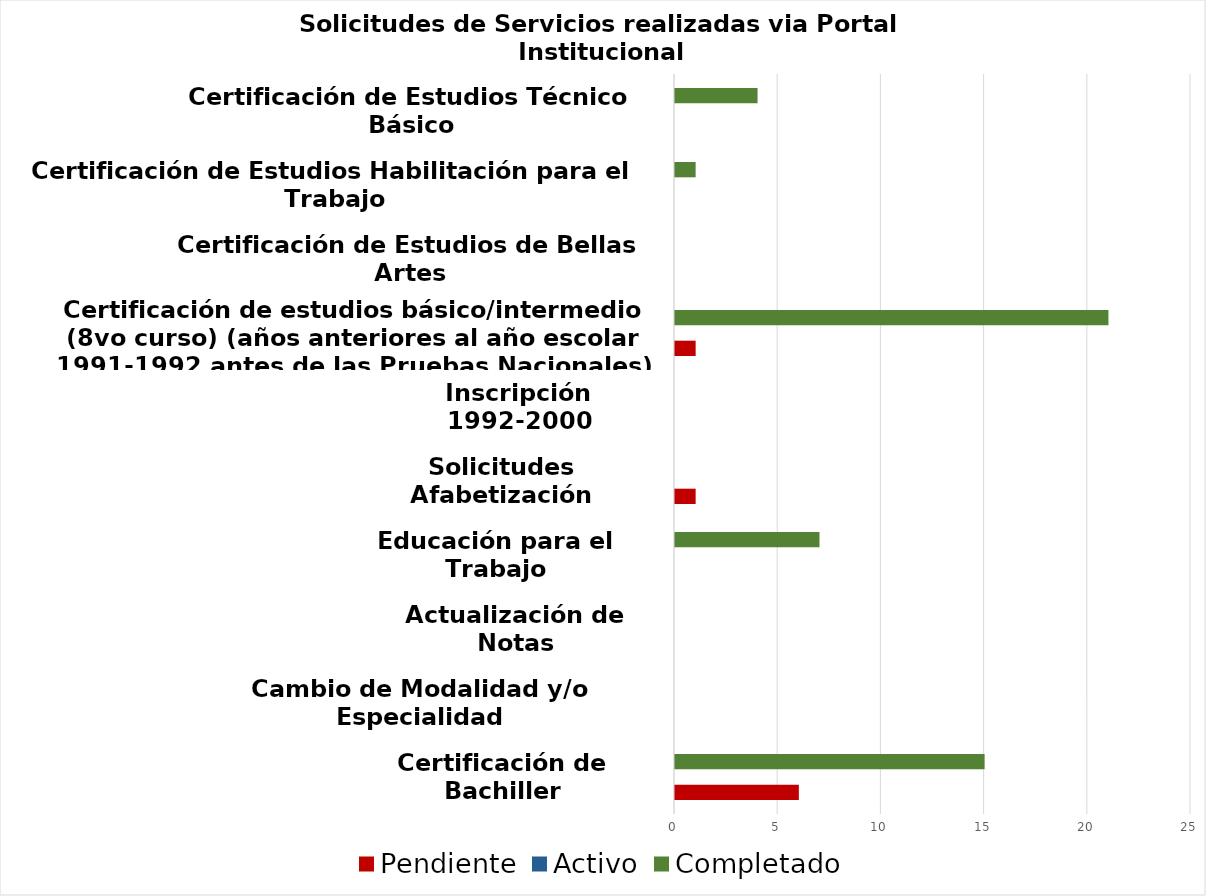
| Category | Pendiente | Activo | Completado |
|---|---|---|---|
| Certificación de Bachiller | 6 | 0 | 15 |
| Cambio de Modalidad y/o Especialidad | 0 | 0 | 0 |
| Actualización de Notas | 0 | 0 | 0 |
| Educación para el Trabajo | 0 | 0 | 7 |
| Solicitudes Afabetización | 1 | 0 | 0 |
| Inscripción 1992-2000 | 0 | 0 | 0 |
| Certificación de estudios básico/intermedio (8vo curso) (años anteriores al año escolar 1991-1992 antes de las Pruebas Nacionales) | 1 | 0 | 21 |
| Certificación de Estudios de Bellas Artes | 0 | 0 | 0 |
| Certificación de Estudios Habilitación para el Trabajo | 0 | 0 | 1 |
| Certificación de Estudios Técnico Básico | 0 | 0 | 4 |